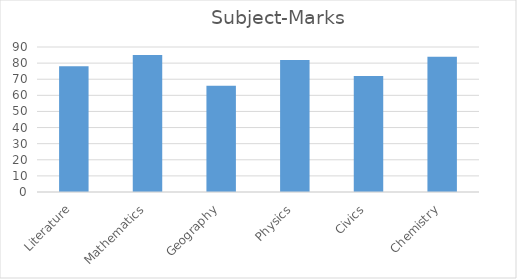
| Category | Series 0 |
|---|---|
| Literature | 78 |
| Mathematics | 85 |
| Geography | 66 |
| Physics | 82 |
| Civics | 72 |
| Chemistry | 84 |